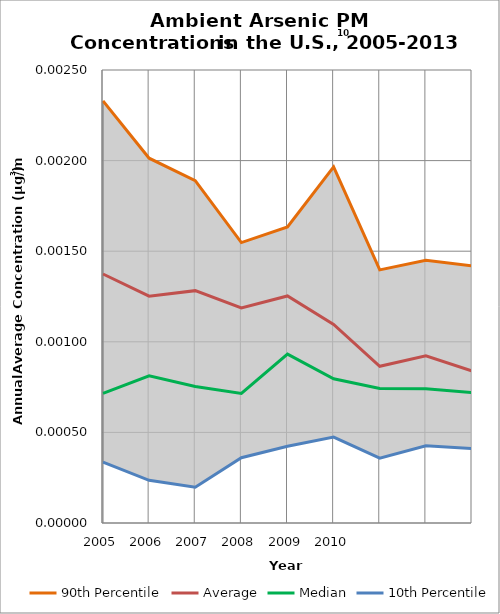
| Category | 90th Percentile | Average | Median | 10th Percentile |
|---|---|---|---|---|
| 2005.0 | 0.002 | 0.001 | 0.001 | 0 |
| 2006.0 | 0.002 | 0.001 | 0.001 | 0 |
| 2007.0 | 0.002 | 0.001 | 0.001 | 0 |
| 2008.0 | 0.002 | 0.001 | 0.001 | 0 |
| 2009.0 | 0.002 | 0.001 | 0.001 | 0 |
| 2010.0 | 0.002 | 0.001 | 0.001 | 0 |
| 2011.0 | 0.001 | 0.001 | 0.001 | 0 |
| 2012.0 | 0.001 | 0.001 | 0.001 | 0 |
| 2013.0 | 0.001 | 0.001 | 0.001 | 0 |